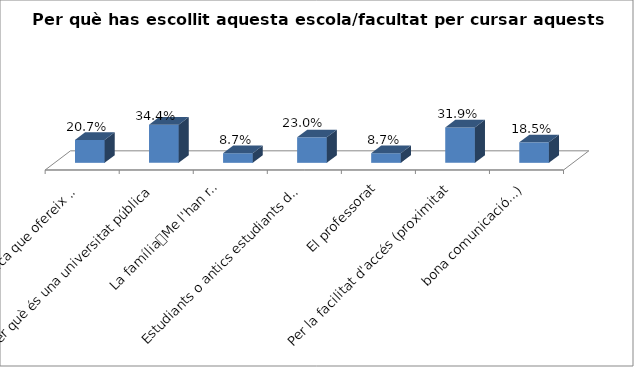
| Category | Series 0 |
|---|---|
| 0 | 0.207 |
| 1 | 0.344 |
| 2 | 0.087 |
| 3 | 0.23 |
| 4 | 0.087 |
| 5 | 0.319 |
| 6 | 0.185 |